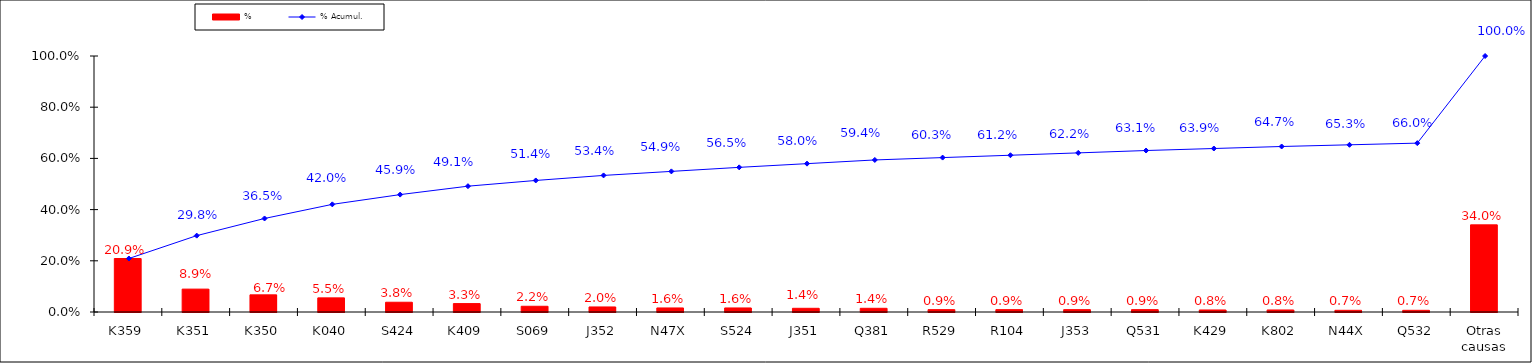
| Category | % |
|---|---|
| K359 | 0.209 |
| K351 | 0.089 |
| K350 | 0.067 |
| K040 | 0.055 |
| S424 | 0.038 |
| K409 | 0.033 |
| S069 | 0.022 |
| J352 | 0.02 |
| N47X | 0.016 |
| S524 | 0.016 |
| J351 | 0.014 |
| Q381 | 0.014 |
| R529 | 0.009 |
| R104 | 0.009 |
| J353 | 0.009 |
| Q531 | 0.009 |
| K429 | 0.008 |
| K802 | 0.008 |
| N44X | 0.007 |
| Q532 | 0.007 |
| Otras causas | 0.34 |